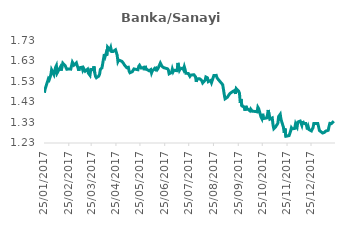
| Category | Banka/Sanayi Oranı |
|---|---|
| 25/01/2017 | 1.474 |
| 26/01/2017 | 1.493 |
| 27/01/2017 | 1.489 |
| 30/01/2017 | 1.542 |
| 31/01/2017 | 1.537 |
| 01/02/2017 | 1.535 |
| 02/02/2017 | 1.56 |
| 03/02/2017 | 1.586 |
| 06/02/2017 | 1.562 |
| 07/02/2017 | 1.581 |
| 08/02/2017 | 1.598 |
| 09/02/2017 | 1.606 |
| 10/02/2017 | 1.57 |
| 13/02/2017 | 1.592 |
| 14/02/2017 | 1.598 |
| 15/02/2017 | 1.582 |
| 16/02/2017 | 1.601 |
| 17/02/2017 | 1.618 |
| 20/02/2017 | 1.605 |
| 21/02/2017 | 1.609 |
| 22/02/2017 | 1.588 |
| 23/02/2017 | 1.592 |
| 24/02/2017 | 1.589 |
| 27/02/2017 | 1.589 |
| 28/02/2017 | 1.59 |
| 01/03/2017 | 1.622 |
| 02/03/2017 | 1.622 |
| 03/03/2017 | 1.608 |
| 06/03/2017 | 1.619 |
| 07/03/2017 | 1.606 |
| 08/03/2017 | 1.596 |
| 09/03/2017 | 1.581 |
| 10/03/2017 | 1.595 |
| 13/03/2017 | 1.598 |
| 14/03/2017 | 1.584 |
| 15/03/2017 | 1.593 |
| 16/03/2017 | 1.588 |
| 17/03/2017 | 1.579 |
| 20/03/2017 | 1.588 |
| 21/03/2017 | 1.569 |
| 22/03/2017 | 1.567 |
| 23/03/2017 | 1.559 |
| 24/03/2017 | 1.587 |
| 27/03/2017 | 1.585 |
| 28/03/2017 | 1.602 |
| 29/03/2017 | 1.57 |
| 30/03/2017 | 1.553 |
| 31/03/2017 | 1.547 |
| 03/04/2017 | 1.555 |
| 04/04/2017 | 1.564 |
| 05/04/2017 | 1.587 |
| 06/04/2017 | 1.588 |
| 07/04/2017 | 1.595 |
| 10/04/2017 | 1.662 |
| 11/04/2017 | 1.65 |
| 12/04/2017 | 1.663 |
| 13/04/2017 | 1.654 |
| 14/04/2017 | 1.696 |
| 17/04/2017 | 1.682 |
| 18/04/2017 | 1.693 |
| 19/04/2017 | 1.675 |
| 20/04/2017 | 1.677 |
| 21/04/2017 | 1.675 |
| 24/04/2017 | 1.682 |
| 25/04/2017 | 1.681 |
| 26/04/2017 | 1.657 |
| 27/04/2017 | 1.625 |
| 28/04/2017 | 1.633 |
| 02/05/2017 | 1.626 |
| 03/05/2017 | 1.624 |
| 04/05/2017 | 1.616 |
| 05/05/2017 | 1.609 |
| 08/05/2017 | 1.596 |
| 09/05/2017 | 1.594 |
| 10/05/2017 | 1.598 |
| 11/05/2017 | 1.579 |
| 12/05/2017 | 1.571 |
| 15/05/2017 | 1.576 |
| 16/05/2017 | 1.583 |
| 17/05/2017 | 1.59 |
| 18/05/2017 | 1.589 |
| 22/05/2017 | 1.586 |
| 23/05/2017 | 1.602 |
| 24/05/2017 | 1.607 |
| 25/05/2017 | 1.607 |
| 26/05/2017 | 1.594 |
| 29/05/2017 | 1.596 |
| 30/05/2017 | 1.583 |
| 31/05/2017 | 1.604 |
| 01/06/2017 | 1.59 |
| 02/06/2017 | 1.586 |
| 05/06/2017 | 1.58 |
| 06/06/2017 | 1.578 |
| 07/06/2017 | 1.586 |
| 08/06/2017 | 1.57 |
| 09/06/2017 | 1.58 |
| 12/06/2017 | 1.592 |
| 13/06/2017 | 1.587 |
| 14/06/2017 | 1.592 |
| 15/06/2017 | 1.585 |
| 16/06/2017 | 1.591 |
| 19/06/2017 | 1.618 |
| 20/06/2017 | 1.61 |
| 21/06/2017 | 1.603 |
| 22/06/2017 | 1.601 |
| 23/06/2017 | 1.596 |
| 28/06/2017 | 1.59 |
| 29/06/2017 | 1.585 |
| 30/06/2017 | 1.566 |
| 03/07/2017 | 1.572 |
| 04/07/2017 | 1.588 |
| 05/07/2017 | 1.576 |
| 06/07/2017 | 1.583 |
| 07/07/2017 | 1.587 |
| 10/07/2017 | 1.581 |
| 11/07/2017 | 1.619 |
| 12/07/2017 | 1.621 |
| 13/07/2017 | 1.583 |
| 14/07/2017 | 1.59 |
| 17/07/2017 | 1.594 |
| 18/07/2017 | 1.586 |
| 19/07/2017 | 1.6 |
| 20/07/2017 | 1.587 |
| 21/07/2017 | 1.568 |
| 24/07/2017 | 1.567 |
| 25/07/2017 | 1.564 |
| 26/07/2017 | 1.554 |
| 27/07/2017 | 1.56 |
| 28/07/2017 | 1.559 |
| 31/07/2017 | 1.562 |
| 01/08/2017 | 1.565 |
| 02/08/2017 | 1.551 |
| 03/08/2017 | 1.527 |
| 04/08/2017 | 1.541 |
| 07/08/2017 | 1.542 |
| 08/08/2017 | 1.545 |
| 09/08/2017 | 1.536 |
| 10/08/2017 | 1.531 |
| 11/08/2017 | 1.522 |
| 14/08/2017 | 1.535 |
| 15/08/2017 | 1.55 |
| 16/08/2017 | 1.553 |
| 17/08/2017 | 1.546 |
| 18/08/2017 | 1.528 |
| 21/08/2017 | 1.534 |
| 22/08/2017 | 1.523 |
| 23/08/2017 | 1.523 |
| 24/08/2017 | 1.546 |
| 25/08/2017 | 1.558 |
| 28/08/2017 | 1.558 |
| 29/08/2017 | 1.546 |
| 31/08/2017 | 1.536 |
| 05/09/2017 | 1.513 |
| 06/09/2017 | 1.49 |
| 07/09/2017 | 1.465 |
| 08/09/2017 | 1.445 |
| 11/09/2017 | 1.453 |
| 12/09/2017 | 1.459 |
| 13/09/2017 | 1.464 |
| 14/09/2017 | 1.47 |
| 15/09/2017 | 1.471 |
| 18/09/2017 | 1.481 |
| 19/09/2017 | 1.481 |
| 20/09/2017 | 1.485 |
| 21/09/2017 | 1.468 |
| 22/09/2017 | 1.494 |
| 25/09/2017 | 1.481 |
| 26/09/2017 | 1.472 |
| 27/09/2017 | 1.425 |
| 28/09/2017 | 1.443 |
| 29/09/2017 | 1.41 |
| 02/10/2017 | 1.404 |
| 03/10/2017 | 1.387 |
| 04/10/2017 | 1.41 |
| 05/10/2017 | 1.399 |
| 06/10/2017 | 1.397 |
| 09/10/2017 | 1.386 |
| 10/10/2017 | 1.395 |
| 11/10/2017 | 1.396 |
| 12/10/2017 | 1.384 |
| 13/10/2017 | 1.388 |
| 16/10/2017 | 1.383 |
| 17/10/2017 | 1.382 |
| 18/10/2017 | 1.381 |
| 19/10/2017 | 1.404 |
| 20/10/2017 | 1.397 |
| 23/10/2017 | 1.356 |
| 24/10/2017 | 1.348 |
| 25/10/2017 | 1.372 |
| 26/10/2017 | 1.349 |
| 27/10/2017 | 1.351 |
| 30/10/2017 | 1.352 |
| 31/10/2017 | 1.366 |
| 01/11/2017 | 1.39 |
| 02/11/2017 | 1.387 |
| 03/11/2017 | 1.346 |
| 06/11/2017 | 1.352 |
| 07/11/2017 | 1.317 |
| 08/11/2017 | 1.299 |
| 09/11/2017 | 1.298 |
| 10/11/2017 | 1.307 |
| 13/11/2017 | 1.326 |
| 14/11/2017 | 1.358 |
| 15/11/2017 | 1.363 |
| 16/11/2017 | 1.369 |
| 17/11/2017 | 1.344 |
| 20/11/2017 | 1.306 |
| 21/11/2017 | 1.279 |
| 22/11/2017 | 1.3 |
| 23/11/2017 | 1.263 |
| 24/11/2017 | 1.259 |
| 27/11/2017 | 1.266 |
| 28/11/2017 | 1.263 |
| 29/11/2017 | 1.288 |
| 30/11/2017 | 1.304 |
| 01/12/2017 | 1.299 |
| 04/12/2017 | 1.301 |
| 05/12/2017 | 1.321 |
| 06/12/2017 | 1.31 |
| 07/12/2017 | 1.305 |
| 08/12/2017 | 1.332 |
| 11/12/2017 | 1.336 |
| 12/12/2017 | 1.332 |
| 13/12/2017 | 1.316 |
| 14/12/2017 | 1.337 |
| 15/12/2017 | 1.325 |
| 18/12/2017 | 1.325 |
| 19/12/2017 | 1.312 |
| 20/12/2017 | 1.296 |
| 21/12/2017 | 1.309 |
| 22/12/2017 | 1.295 |
| 25/12/2017 | 1.289 |
| 26/12/2017 | 1.298 |
| 27/12/2017 | 1.304 |
| 28/12/2017 | 1.324 |
| 29/12/2017 | 1.324 |
| 02/01/2018 | 1.324 |
| 03/01/2018 | 1.309 |
| 04/01/2018 | 1.291 |
| 05/01/2018 | 1.287 |
| 08/01/2018 | 1.279 |
| 09/01/2018 | 1.276 |
| 10/01/2018 | 1.281 |
| 11/01/2018 | 1.284 |
| 12/01/2018 | 1.288 |
| 15/01/2018 | 1.292 |
| 16/01/2018 | 1.31 |
| 17/01/2018 | 1.325 |
| 18/01/2018 | 1.328 |
| 19/01/2018 | 1.324 |
| 22/01/2018 | 1.336 |
| 23/01/2018 | 1.339 |